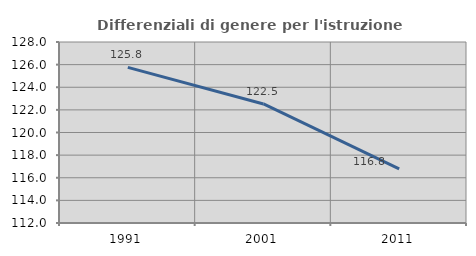
| Category | Differenziali di genere per l'istruzione superiore |
|---|---|
| 1991.0 | 125.754 |
| 2001.0 | 122.524 |
| 2011.0 | 116.778 |